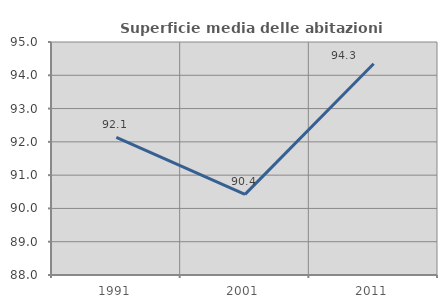
| Category | Superficie media delle abitazioni occupate |
|---|---|
| 1991.0 | 92.133 |
| 2001.0 | 90.423 |
| 2011.0 | 94.345 |